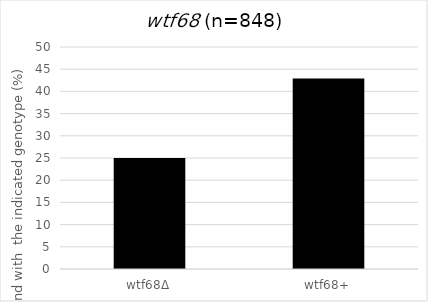
| Category | spores that are viable and with the indicated genotype |
|---|---|
| wtf68Δ | 25 |
| wtf68+ | 42.925 |